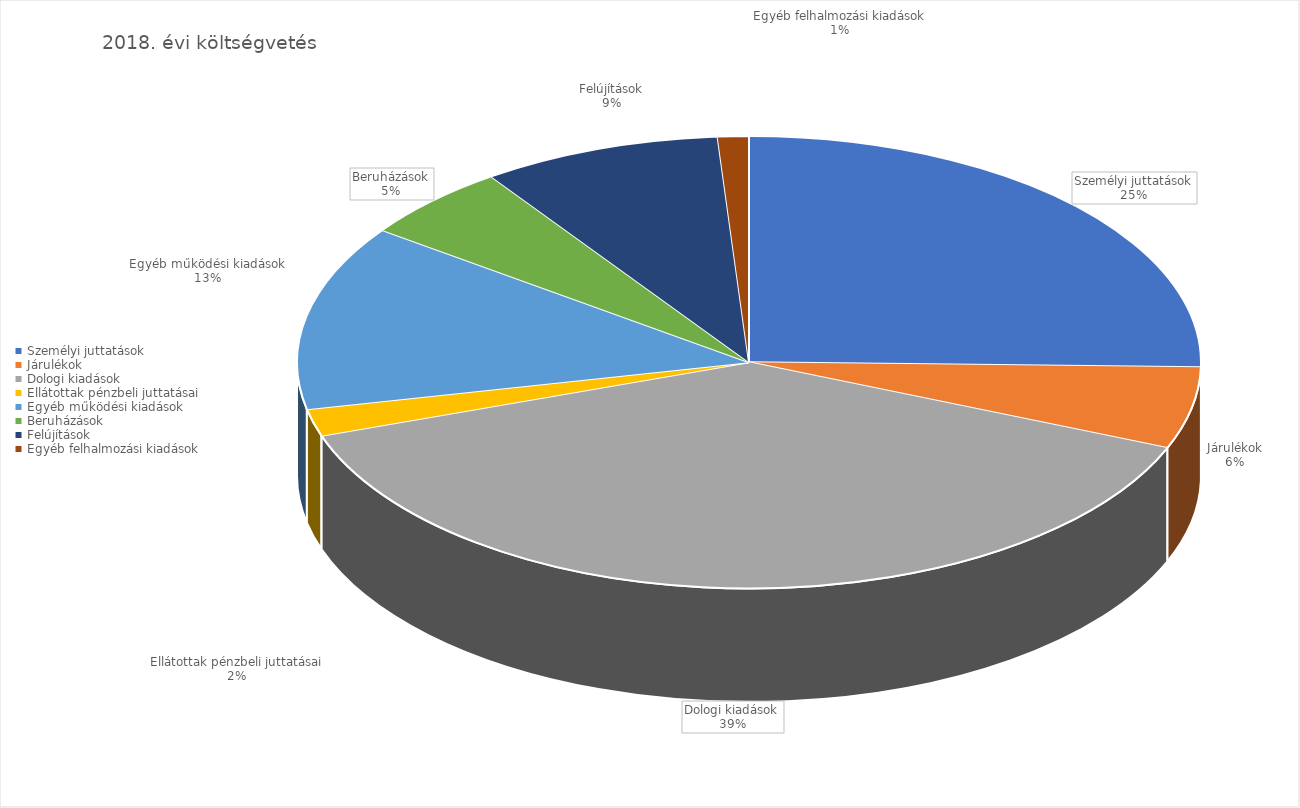
| Category | 2018 |
|---|---|
| Személyi juttatások | 7532985548 |
| Járulékok | 1737290781 |
| Dologi kiadások | 11449608652 |
| Ellátottak pénzbeli juttatásai | 575850000 |
| Egyéb működési kiadások | 3942625601 |
| Beruházások | 1609075178 |
| Felújítások | 2541000000 |
| Egyéb felhalmozási kiadások | 329000000 |